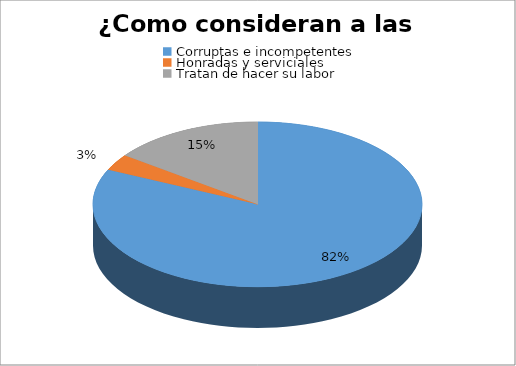
| Category | Series 0 |
|---|---|
| Corruptas e incompetentes | 77 |
| Honradas y serviciales | 3 |
| Tratan de hacer su labor | 14 |